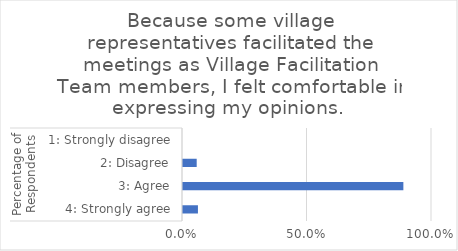
| Category | Because some village representatives facilitated the meetings as Village Facilitation Team members, I felt comfortable in expressing my opinions.  |
|---|---|
| 0 | 0.06 |
| 1 | 0.885 |
| 2 | 0.055 |
| 3 | 0 |